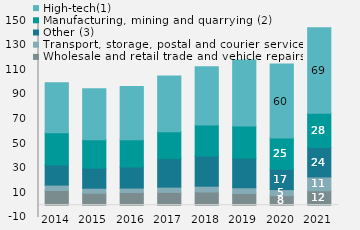
| Category | Wholesale and retail trade and vehicle repairs | Transport, storage, postal and courier services | Other (3) | Manufacturing, mining and quarrying (2) | High-tech(1) |
|---|---|---|---|---|---|
| 2014 | 11947 | 4388 | 16301.4 | 26272.6 | 40553 |
| 2015 | 9694 | 4088 | 16353 | 23101 | 41342 |
| 2016 | 10231 | 3683 | 17101 | 22143 | 43144 |
| 2017 | 10406 | 4228 | 23155.8 | 21932.2 | 45110 |
| 2018 | 10730 | 4693 | 24473 | 25267 | 47258 |
| 2019 | 9479 | 4677 | 24026.6 | 26165.4 | 53620 |
| 2020 | 7741 | 4937 | 16502.7 | 25454.3 | 59958 |
| 2021 | 11749 | 11204 | 23948.9 | 27794.1 | 69420 |